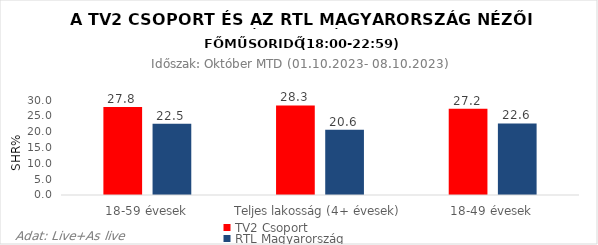
| Category | TV2 Csoport | RTL Magyarország |
|---|---|---|
| 18-59 évesek | 27.8 | 22.5 |
| Teljes lakosság (4+ évesek) | 28.3 | 20.6 |
| 18-49 évesek | 27.2 | 22.6 |